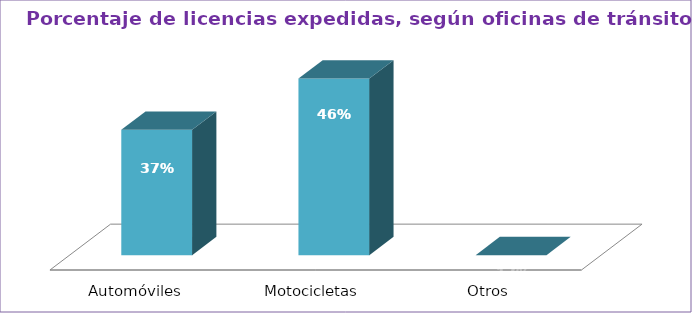
| Category | Series 0 |
|---|---|
| Automóviles  | 41.508 |
| Motocicletas  | 58.492 |
| Otros  | 0 |